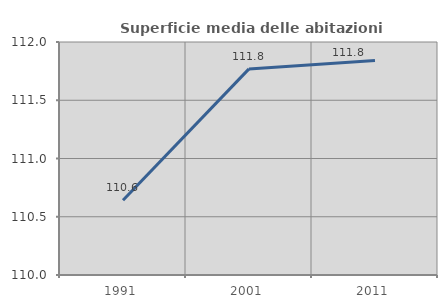
| Category | Superficie media delle abitazioni occupate |
|---|---|
| 1991.0 | 110.641 |
| 2001.0 | 111.769 |
| 2011.0 | 111.842 |